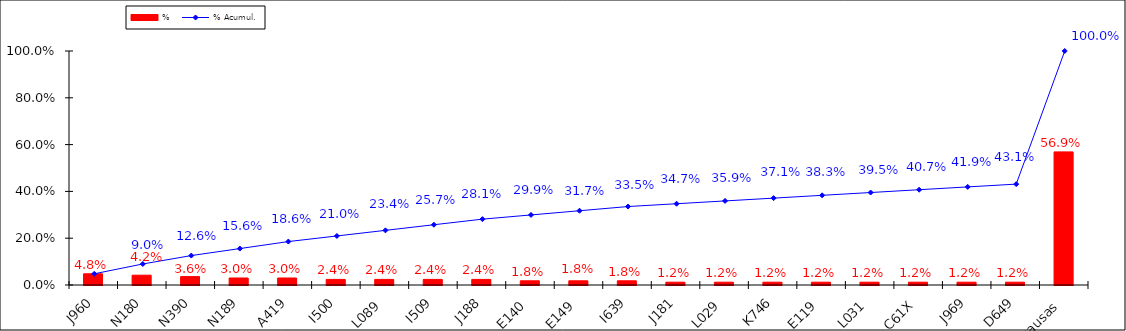
| Category | % |
|---|---|
| J960 | 0.048 |
| N180 | 0.042 |
| N390 | 0.036 |
| N189 | 0.03 |
| A419 | 0.03 |
| I500 | 0.024 |
| L089 | 0.024 |
| I509 | 0.024 |
| J188 | 0.024 |
| E140 | 0.018 |
| E149 | 0.018 |
| I639 | 0.018 |
| J181 | 0.012 |
| L029 | 0.012 |
| K746 | 0.012 |
| E119 | 0.012 |
| L031 | 0.012 |
| C61X | 0.012 |
| J969 | 0.012 |
| D649 | 0.012 |
| Otras causas | 0.569 |